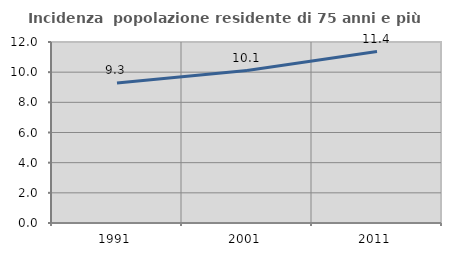
| Category | Incidenza  popolazione residente di 75 anni e più |
|---|---|
| 1991.0 | 9.289 |
| 2001.0 | 10.108 |
| 2011.0 | 11.364 |